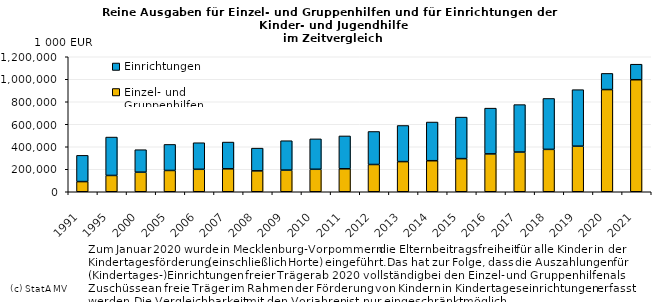
| Category | Einzel- und Gruppenhilfen | Einrichtungen |
|---|---|---|
| 0 | 90360 | 233292 |
| 1 | 144899 | 341324 |
| 2 | 173906 | 199851 |
| 3 | 189191 | 231504 |
| 4 | 199661 | 236113 |
| 5 | 203990 | 237757 |
| 6 | 185828 | 202073 |
| 7 | 192260 | 261355 |
| 8 | 199726 | 270369 |
| 9 | 204111 | 292060 |
| 10 | 242227 | 293602 |
| 11 | 268019 | 321049 |
| 12 | 275922 | 343890 |
| 13 | 294463 | 369024 |
| 14 | 336576 | 406740 |
| 15 | 352821 | 421805 |
| 16 | 376778 | 452531 |
| 17 | 405081 | 502343 |
| 18 | 908202 | 143868 |
| 19 | 995770 | 138075 |